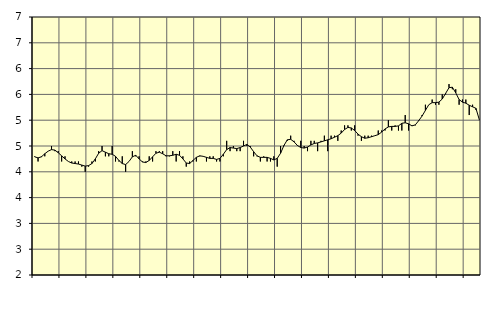
| Category | Piggar | Personliga och kulturella tjänster, SNI 90-98 |
|---|---|---|
| nan | 4.3 | 4.29 |
| 87.0 | 4.2 | 4.27 |
| 87.0 | 4.3 | 4.29 |
| 87.0 | 4.3 | 4.35 |
| nan | 4.4 | 4.4 |
| 88.0 | 4.5 | 4.43 |
| 88.0 | 4.4 | 4.42 |
| 88.0 | 4.4 | 4.37 |
| nan | 4.2 | 4.31 |
| 89.0 | 4.3 | 4.25 |
| 89.0 | 4.2 | 4.2 |
| 89.0 | 4.2 | 4.17 |
| nan | 4.2 | 4.16 |
| 90.0 | 4.2 | 4.15 |
| 90.0 | 4.1 | 4.13 |
| 90.0 | 4 | 4.11 |
| nan | 4.1 | 4.12 |
| 91.0 | 4.2 | 4.16 |
| 91.0 | 4.2 | 4.25 |
| 91.0 | 4.4 | 4.36 |
| nan | 4.5 | 4.41 |
| 92.0 | 4.3 | 4.38 |
| 92.0 | 4.3 | 4.35 |
| 92.0 | 4.5 | 4.34 |
| nan | 4.2 | 4.3 |
| 93.0 | 4.2 | 4.22 |
| 93.0 | 4.3 | 4.16 |
| 93.0 | 4 | 4.14 |
| nan | 4.2 | 4.2 |
| 94.0 | 4.4 | 4.29 |
| 94.0 | 4.3 | 4.32 |
| 94.0 | 4.3 | 4.25 |
| nan | 4.2 | 4.19 |
| 95.0 | 4.2 | 4.18 |
| 95.0 | 4.3 | 4.22 |
| 95.0 | 4.2 | 4.29 |
| nan | 4.4 | 4.36 |
| 96.0 | 4.4 | 4.38 |
| 96.0 | 4.4 | 4.35 |
| 96.0 | 4.3 | 4.31 |
| nan | 4.3 | 4.31 |
| 97.0 | 4.4 | 4.32 |
| 97.0 | 4.2 | 4.34 |
| 97.0 | 4.4 | 4.32 |
| nan | 4.3 | 4.25 |
| 98.0 | 4.1 | 4.17 |
| 98.0 | 4.2 | 4.16 |
| 98.0 | 4.2 | 4.22 |
| nan | 4.2 | 4.28 |
| 99.0 | 4.3 | 4.31 |
| 99.0 | 4.3 | 4.3 |
| 99.0 | 4.2 | 4.28 |
| nan | 4.3 | 4.26 |
| 0.0 | 4.3 | 4.26 |
| 0.0 | 4.2 | 4.24 |
| 0.0 | 4.2 | 4.26 |
| nan | 4.3 | 4.34 |
| 1.0 | 4.6 | 4.43 |
| 1.0 | 4.4 | 4.47 |
| 1.0 | 4.5 | 4.46 |
| nan | 4.4 | 4.45 |
| 2.0 | 4.4 | 4.47 |
| 2.0 | 4.6 | 4.5 |
| 2.0 | 4.5 | 4.53 |
| nan | 4.5 | 4.48 |
| 3.0 | 4.3 | 4.39 |
| 3.0 | 4.3 | 4.31 |
| 3.0 | 4.2 | 4.28 |
| nan | 4.3 | 4.28 |
| 4.0 | 4.2 | 4.28 |
| 4.0 | 4.2 | 4.26 |
| 4.0 | 4.3 | 4.23 |
| nan | 4.1 | 4.26 |
| 5.0 | 4.5 | 4.36 |
| 5.0 | 4.5 | 4.51 |
| 5.0 | 4.6 | 4.62 |
| nan | 4.7 | 4.63 |
| 6.0 | 4.6 | 4.58 |
| 6.0 | 4.5 | 4.51 |
| 6.0 | 4.6 | 4.47 |
| nan | 4.5 | 4.46 |
| 7.0 | 4.4 | 4.48 |
| 7.0 | 4.6 | 4.52 |
| 7.0 | 4.6 | 4.55 |
| nan | 4.4 | 4.56 |
| 8.0 | 4.6 | 4.58 |
| 8.0 | 4.7 | 4.6 |
| 8.0 | 4.4 | 4.62 |
| nan | 4.7 | 4.64 |
| 9.0 | 4.7 | 4.67 |
| 9.0 | 4.6 | 4.7 |
| 9.0 | 4.8 | 4.75 |
| nan | 4.9 | 4.82 |
| 10.0 | 4.9 | 4.86 |
| 10.0 | 4.8 | 4.85 |
| 10.0 | 4.9 | 4.8 |
| nan | 4.7 | 4.73 |
| 11.0 | 4.6 | 4.68 |
| 11.0 | 4.7 | 4.65 |
| 11.0 | 4.7 | 4.66 |
| nan | 4.7 | 4.68 |
| 12.0 | 4.7 | 4.7 |
| 12.0 | 4.8 | 4.72 |
| 12.0 | 4.8 | 4.77 |
| nan | 4.8 | 4.83 |
| 13.0 | 5 | 4.87 |
| 13.0 | 4.8 | 4.88 |
| 13.0 | 4.9 | 4.88 |
| nan | 4.8 | 4.89 |
| 14.0 | 4.8 | 4.94 |
| 14.0 | 5.1 | 4.95 |
| 14.0 | 4.8 | 4.93 |
| nan | 4.9 | 4.89 |
| 15.0 | 4.9 | 4.91 |
| 15.0 | 5 | 4.99 |
| 15.0 | 5.1 | 5.08 |
| nan | 5.3 | 5.19 |
| 16.0 | 5.3 | 5.3 |
| 16.0 | 5.4 | 5.34 |
| 16.0 | 5.3 | 5.34 |
| nan | 5.3 | 5.35 |
| 17.0 | 5.5 | 5.41 |
| 17.0 | 5.5 | 5.52 |
| 17.0 | 5.7 | 5.63 |
| nan | 5.6 | 5.64 |
| 18.0 | 5.6 | 5.53 |
| 18.0 | 5.3 | 5.4 |
| 18.0 | 5.4 | 5.35 |
| nan | 5.4 | 5.33 |
| 19.0 | 5.1 | 5.29 |
| 19.0 | 5.3 | 5.26 |
| 19.0 | 5.2 | 5.23 |
| nan | 5 | 5.01 |